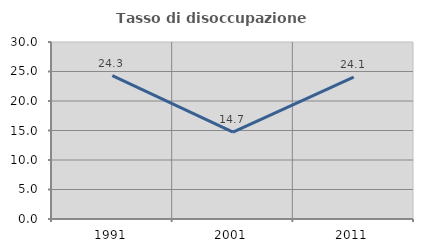
| Category | Tasso di disoccupazione giovanile  |
|---|---|
| 1991.0 | 24.314 |
| 2001.0 | 14.741 |
| 2011.0 | 24.062 |